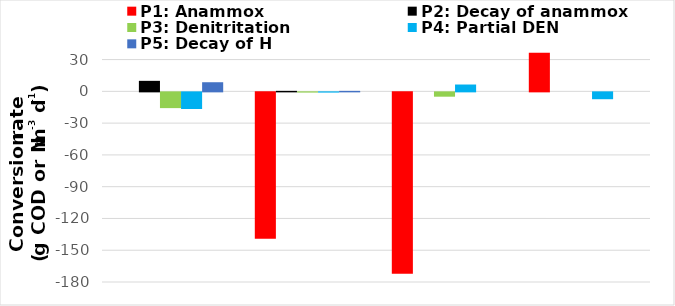
| Category | P1: Anammox | P2: Decay of anammox | P3: Denitritation | P4: Partial DEN | P5: Decay of H |
|---|---|---|---|---|---|
| 0 | 0 | 9.936 | -14.876 | -15.685 | 8.625 |
| 1 | -138.112 | 0.473 | -0.208 | -0.219 | 0.467 |
| 2 | -171.378 | 0 | -4.089 | 6.467 | 0 |
| 3 | 36.467 | 0 | 0 | -6.467 | 0 |